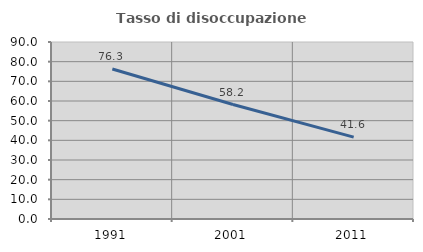
| Category | Tasso di disoccupazione giovanile  |
|---|---|
| 1991.0 | 76.252 |
| 2001.0 | 58.219 |
| 2011.0 | 41.648 |